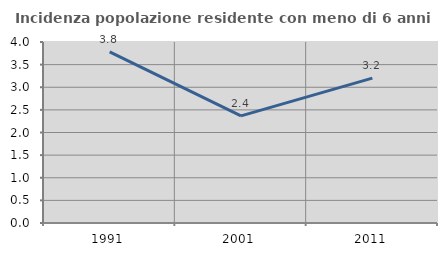
| Category | Incidenza popolazione residente con meno di 6 anni |
|---|---|
| 1991.0 | 3.781 |
| 2001.0 | 2.368 |
| 2011.0 | 3.201 |